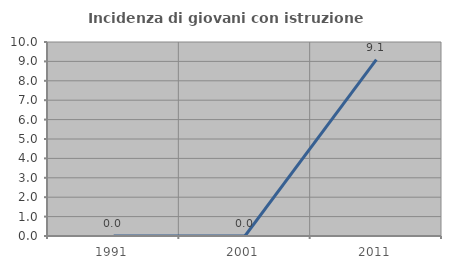
| Category | Incidenza di giovani con istruzione universitaria |
|---|---|
| 1991.0 | 0 |
| 2001.0 | 0 |
| 2011.0 | 9.091 |